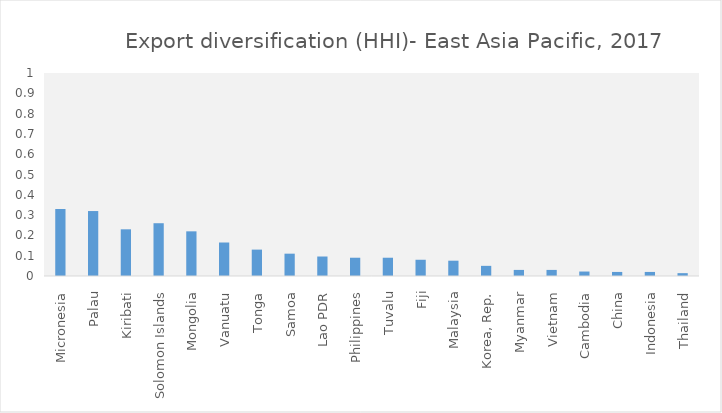
| Category | 2017 |
|---|---|
| Micronesia | 0.33 |
| Palau | 0.32 |
| Kiribati | 0.23 |
| Solomon Islands | 0.26 |
| Mongolia | 0.22 |
| Vanuatu | 0.165 |
| Tonga | 0.13 |
| Samoa | 0.11 |
| Lao PDR | 0.096 |
| Philippines | 0.09 |
| Tuvalu | 0.09 |
| Fiji | 0.08 |
| Malaysia | 0.075 |
| Korea, Rep. | 0.05 |
| Myanmar | 0.03 |
| Vietnam | 0.03 |
| Cambodia | 0.022 |
| China | 0.02 |
| Indonesia | 0.02 |
| Thailand | 0.014 |